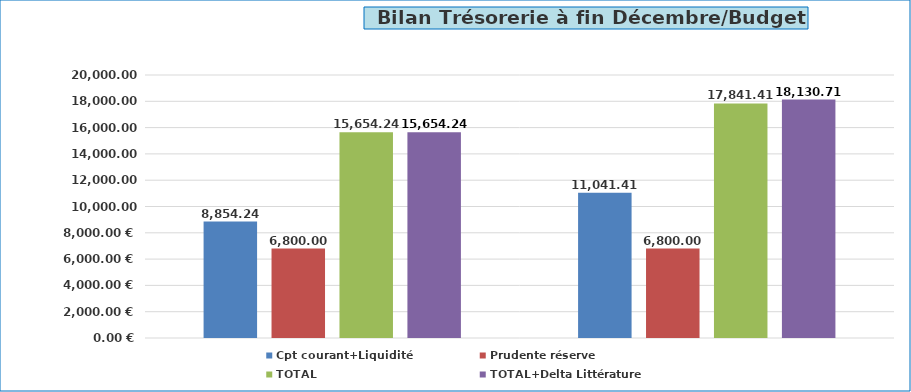
| Category | Cpt courant+Liquidité | Prudente réserve | TOTAL | TOTAL+Delta Littérature |
|---|---|---|---|---|
| Budget | 8854.24 | 6800 | 15654.24 | 15654.24 |
| 2022 | 11041.41 | 6800 | 17841.41 | 18130.71 |